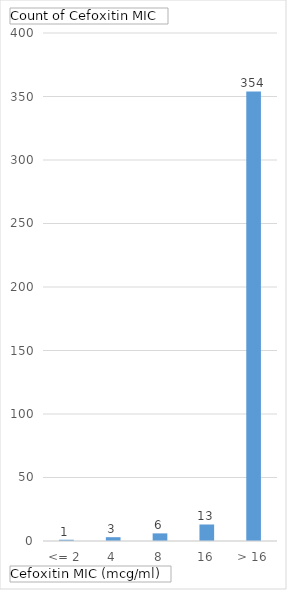
| Category | Total |
|---|---|
| <= 2 | 1 |
| 4 | 3 |
| 8 | 6 |
| 16 | 13 |
| > 16 | 354 |